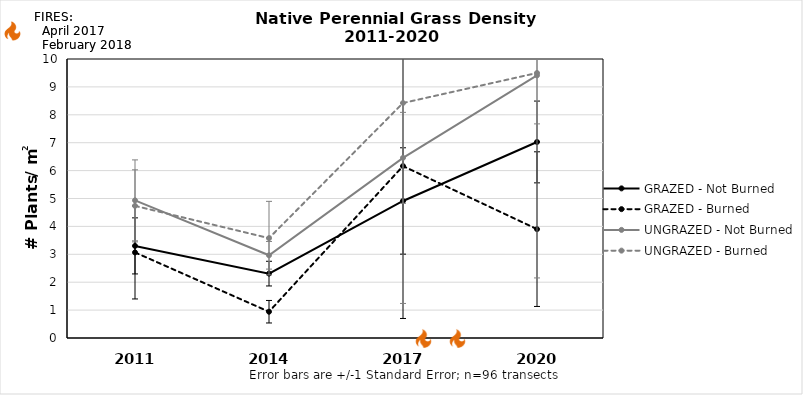
| Category | GRAZED - Not Burned | GRAZED - Burned | UNGRAZED - Not Burned | UNGRAZED - Burned |
|---|---|---|---|---|
| 2011.0 | 3.301 | 3.068 | 4.933 | 4.736 |
| 2014.0 | 2.308 | 0.942 | 2.965 | 3.579 |
| 2017.0 | 4.912 | 6.162 | 6.457 | 8.423 |
| 2020.0 | 7.026 | 3.902 | 9.413 | 9.499 |